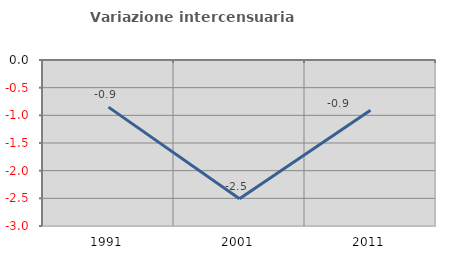
| Category | Variazione intercensuaria annua |
|---|---|
| 1991.0 | -0.851 |
| 2001.0 | -2.509 |
| 2011.0 | -0.907 |